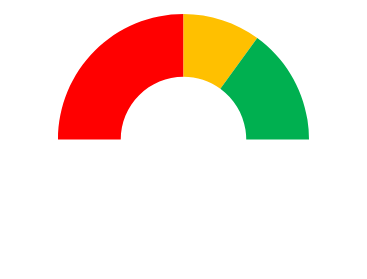
| Category | Series 0 |
|---|---|
| 0 | 50 |
| 1 | 20 |
| 2 | 30 |
| 3 | 100 |